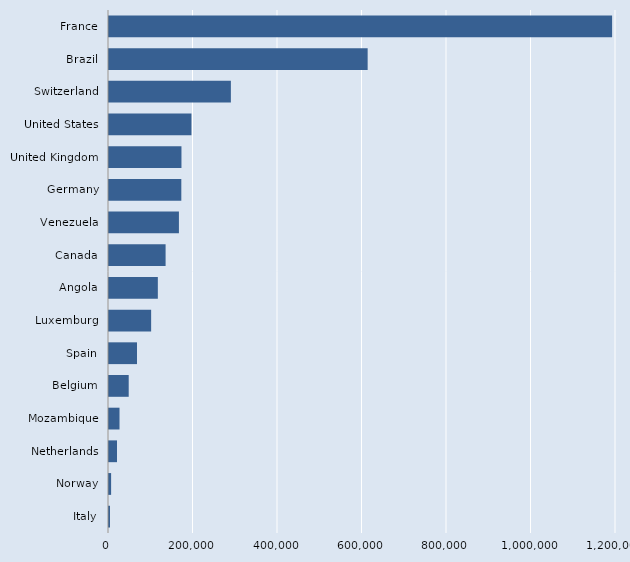
| Category | Series 0 |
|---|---|
| Italy | 2337 |
| Norway | 5001 |
| Netherlands | 18992 |
| Mozambique | 24871 |
| Belgium | 46642 |
| Spain | 66212 |
| Luxemburg | 99738 |
| Angola | 115595 |
| Canada | 133954 |
| Venezuela | 165498 |
| Germany | 171166 |
| United Kingdom | 171497 |
| United States | 195164 |
| Switzerland | 288465 |
| Brazil | 612203 |
| France | 1190798 |